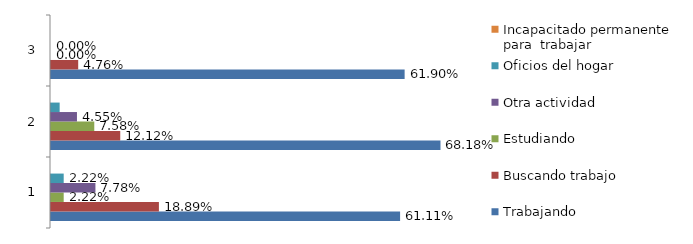
| Category | Trabajando          | Buscando trabajo        | Estudiando          | Otra actividad | Oficios del hogar | Incapacitado permanente para  trabajar   |
|---|---|---|---|---|---|---|
| 0 | 0.611 | 0.189 | 0.022 | 0.078 | 0.022 | 0 |
| 1 | 0.682 | 0.121 | 0.076 | 0.045 | 0.015 | 0 |
| 2 | 0.619 | 0.048 | 0 | 0 | 0 | 0 |